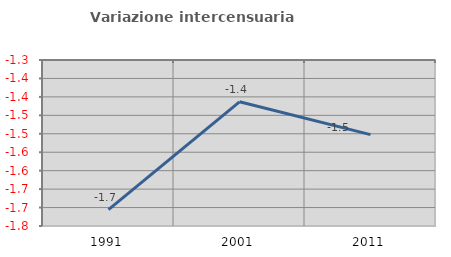
| Category | Variazione intercensuaria annua |
|---|---|
| 1991.0 | -1.706 |
| 2001.0 | -1.413 |
| 2011.0 | -1.502 |